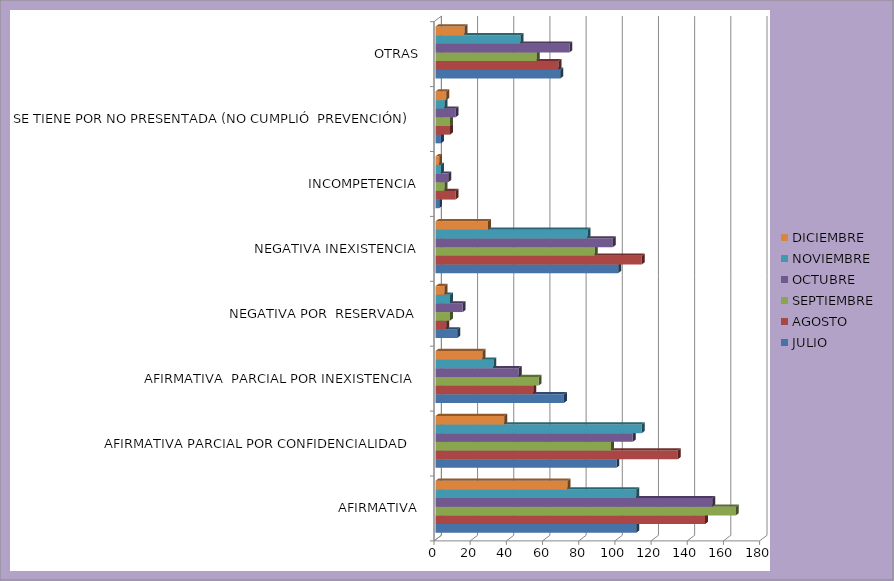
| Category | JULIO | AGOSTO | SEPTIEMBRE | OCTUBRE | NOVIEMBRE | DICIEMBRE |
|---|---|---|---|---|---|---|
| AFIRMATIVA | 111 | 149 | 166 | 153 | 111 | 73 |
| AFIRMATIVA PARCIAL POR CONFIDENCIALIDAD  | 100 | 134 | 97 | 109 | 114 | 38 |
| AFIRMATIVA  PARCIAL POR INEXISTENCIA | 71 | 54 | 57 | 46 | 32 | 26 |
|  NEGATIVA POR  RESERVADA | 12 | 6 | 8 | 15 | 8 | 5 |
| NEGATIVA INEXISTENCIA | 101 | 114 | 88 | 98 | 84 | 29 |
| INCOMPETENCIA | 2 | 11 | 5 | 7 | 3 | 2 |
| SE TIENE POR NO PRESENTADA (NO CUMPLIÓ  PREVENCIÓN) | 3 | 8 | 8 | 11 | 5 | 6 |
| OTRAS | 69 | 68 | 56 | 74 | 47 | 16 |